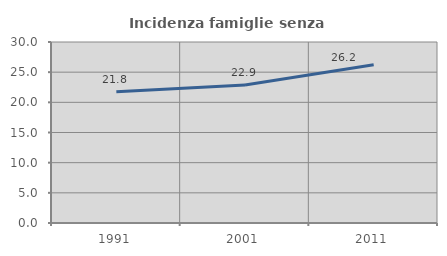
| Category | Incidenza famiglie senza nuclei |
|---|---|
| 1991.0 | 21.766 |
| 2001.0 | 22.862 |
| 2011.0 | 26.236 |